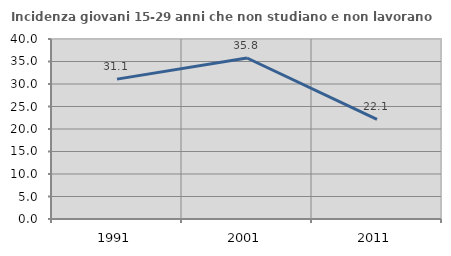
| Category | Incidenza giovani 15-29 anni che non studiano e non lavorano  |
|---|---|
| 1991.0 | 31.083 |
| 2001.0 | 35.78 |
| 2011.0 | 22.143 |